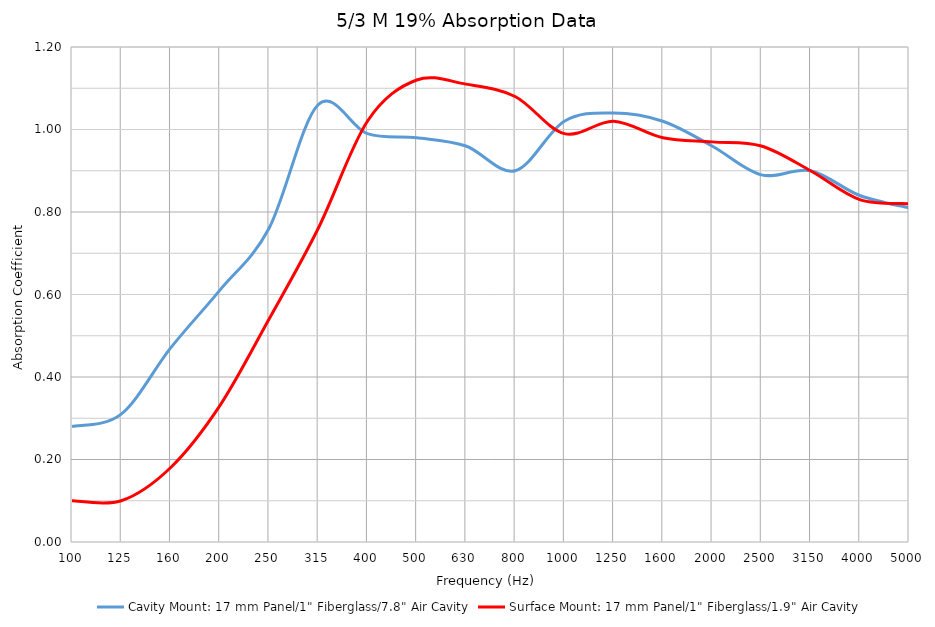
| Category | Cavity Mount: 17 mm Panel/1" Fiberglass/7.8" Air Cavity | Surface Mount: 17 mm Panel/1" Fiberglass/1.9" Air Cavity |
|---|---|---|
| 100.0 | 0.28 | 0.1 |
| 125.0 | 0.31 | 0.1 |
| 160.0 | 0.47 | 0.18 |
| 200.0 | 0.61 | 0.33 |
| 250.0 | 0.76 | 0.54 |
| 315.0 | 1.06 | 0.76 |
| 400.0 | 0.99 | 1.02 |
| 500.0 | 0.98 | 1.12 |
| 630.0 | 0.96 | 1.11 |
| 800.0 | 0.9 | 1.08 |
| 1000.0 | 1.02 | 0.99 |
| 1250.0 | 1.04 | 1.02 |
| 1600.0 | 1.02 | 0.98 |
| 2000.0 | 0.96 | 0.97 |
| 2500.0 | 0.89 | 0.96 |
| 3150.0 | 0.9 | 0.9 |
| 4000.0 | 0.84 | 0.83 |
| 5000.0 | 0.81 | 0.82 |